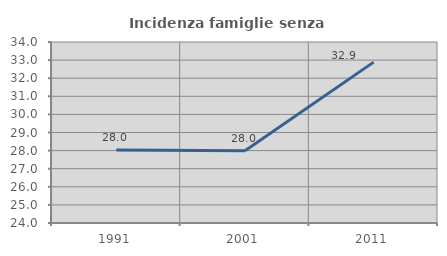
| Category | Incidenza famiglie senza nuclei |
|---|---|
| 1991.0 | 28.032 |
| 2001.0 | 27.993 |
| 2011.0 | 32.889 |